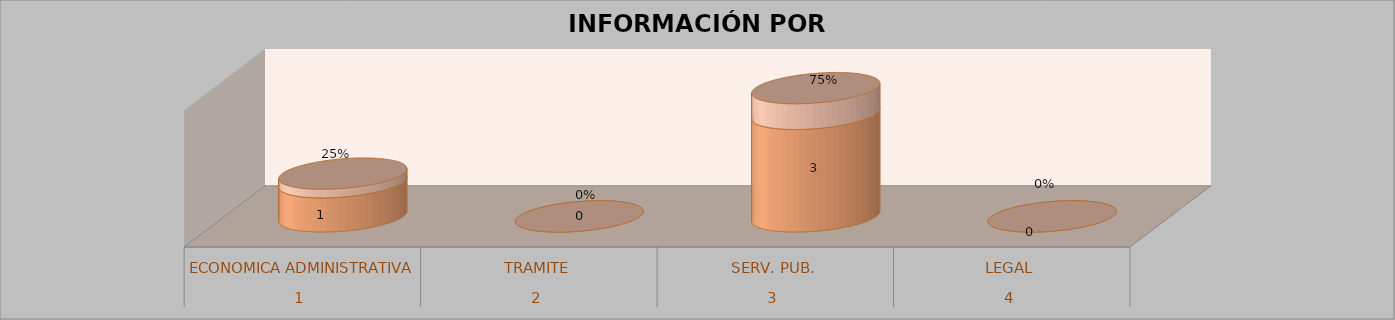
| Category | Series 0 | Series 1 | Series 2 | Series 3 |
|---|---|---|---|---|
| 0 |  |  | 1 | 0.25 |
| 1 |  |  | 0 | 0 |
| 2 |  |  | 3 | 0.75 |
| 3 |  |  | 0 | 0 |